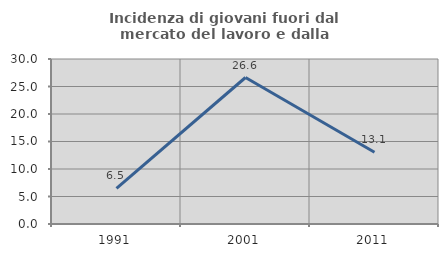
| Category | Incidenza di giovani fuori dal mercato del lavoro e dalla formazione  |
|---|---|
| 1991.0 | 6.473 |
| 2001.0 | 26.634 |
| 2011.0 | 13.056 |